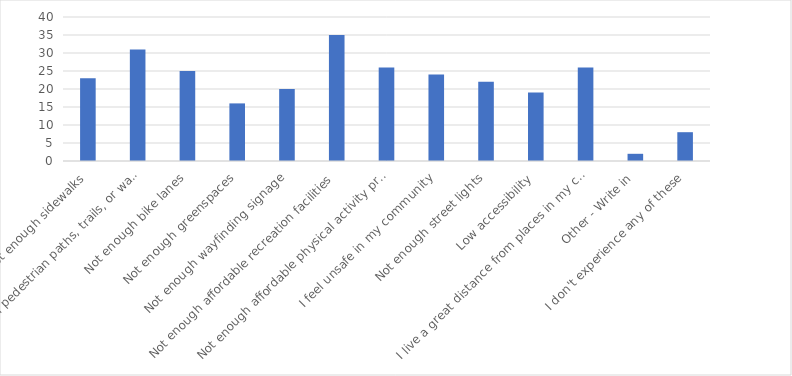
| Category | Number of Responses |
|---|---|
| Not enough sidewalks | 23 |
| Not enough pedestrian paths, trails, or walkways | 31 |
| Not enough bike lanes | 25 |
| Not enough greenspaces | 16 |
| Not enough wayfinding signage | 20 |
| Not enough affordable recreation facilities | 35 |
| Not enough affordable physical activity programs | 26 |
| I feel unsafe in my community | 24 |
| Not enough street lights | 22 |
| Low accessibility | 19 |
| I live a great distance from places in my community | 26 |
| Other - Write in | 2 |
| I don't experience any of these | 8 |